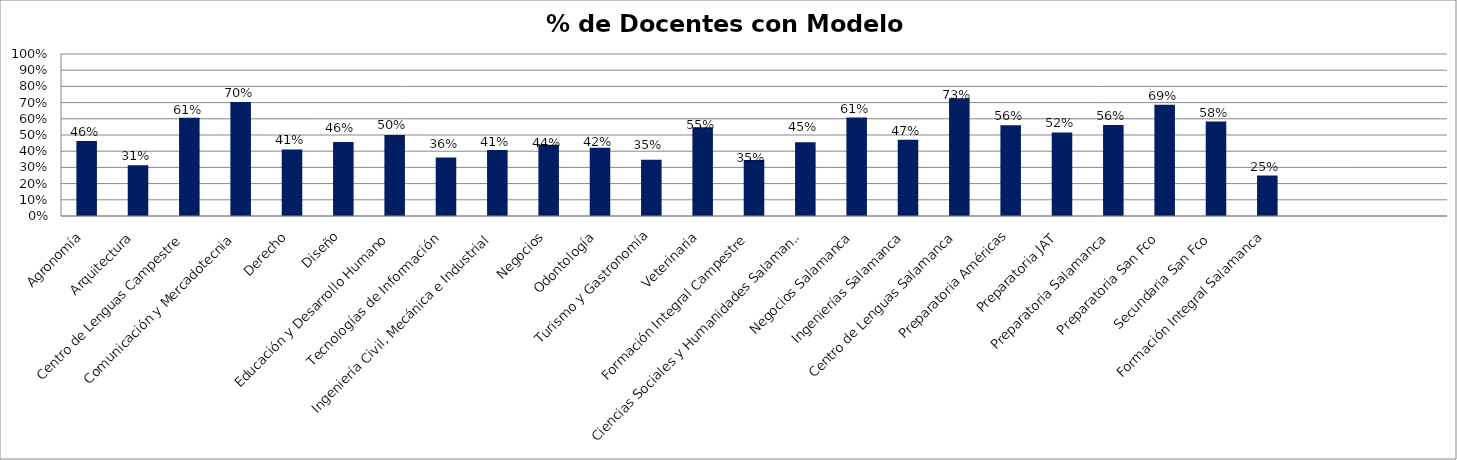
| Category | Series 1 |
|---|---|
| Agronomía | 0.463 |
| Arquitectura | 0.313 |
| Centro de Lenguas Campestre | 0.607 |
| Comunicación y Mercadotecnia | 0.704 |
| Derecho | 0.411 |
| Diseño | 0.457 |
| Educación y Desarrollo Humano | 0.5 |
| Tecnologías de Información | 0.361 |
| Ingeniería Civil, Mecánica e Industrial | 0.407 |
| Negocios | 0.44 |
| Odontología | 0.421 |
| Turismo y Gastronomía | 0.348 |
| Veterinaria | 0.547 |
| Formación Integral Campestre | 0.345 |
| Ciencias Sociales y Humanidades Salamanca | 0.455 |
| Negocios Salamanca | 0.608 |
| Ingenierías Salamanca | 0.471 |
| Centro de Lenguas Salamanca | 0.727 |
| Preparatoria Américas | 0.561 |
| Preparatoria JAT | 0.516 |
| Preparatoria Salamanca | 0.561 |
| Preparatoria San Fco | 0.688 |
| Secundaria San Fco | 0.583 |
| Formación Integral Salamanca | 0.25 |